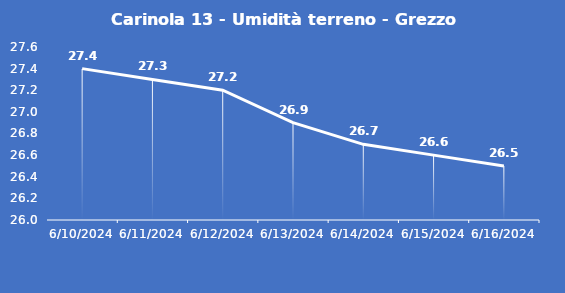
| Category | Carinola 13 - Umidità terreno - Grezzo (%VWC) |
|---|---|
| 6/10/24 | 27.4 |
| 6/11/24 | 27.3 |
| 6/12/24 | 27.2 |
| 6/13/24 | 26.9 |
| 6/14/24 | 26.7 |
| 6/15/24 | 26.6 |
| 6/16/24 | 26.5 |